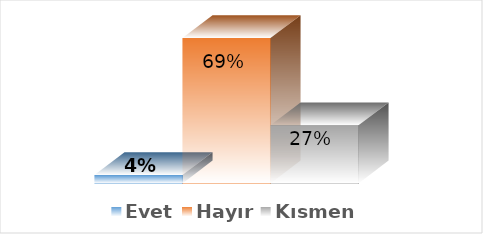
| Category | Evet | Hayır | Kısmen |
|---|---|---|---|
| 0 | 0.039 | 0.686 | 0.275 |